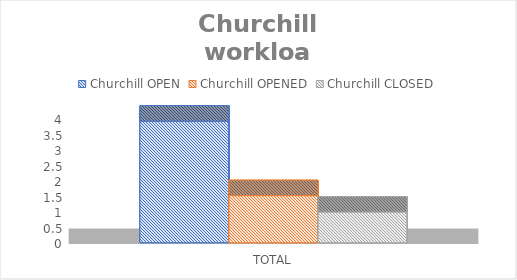
| Category | Churchill |
|---|---|
| TOTAL | 0.994 |